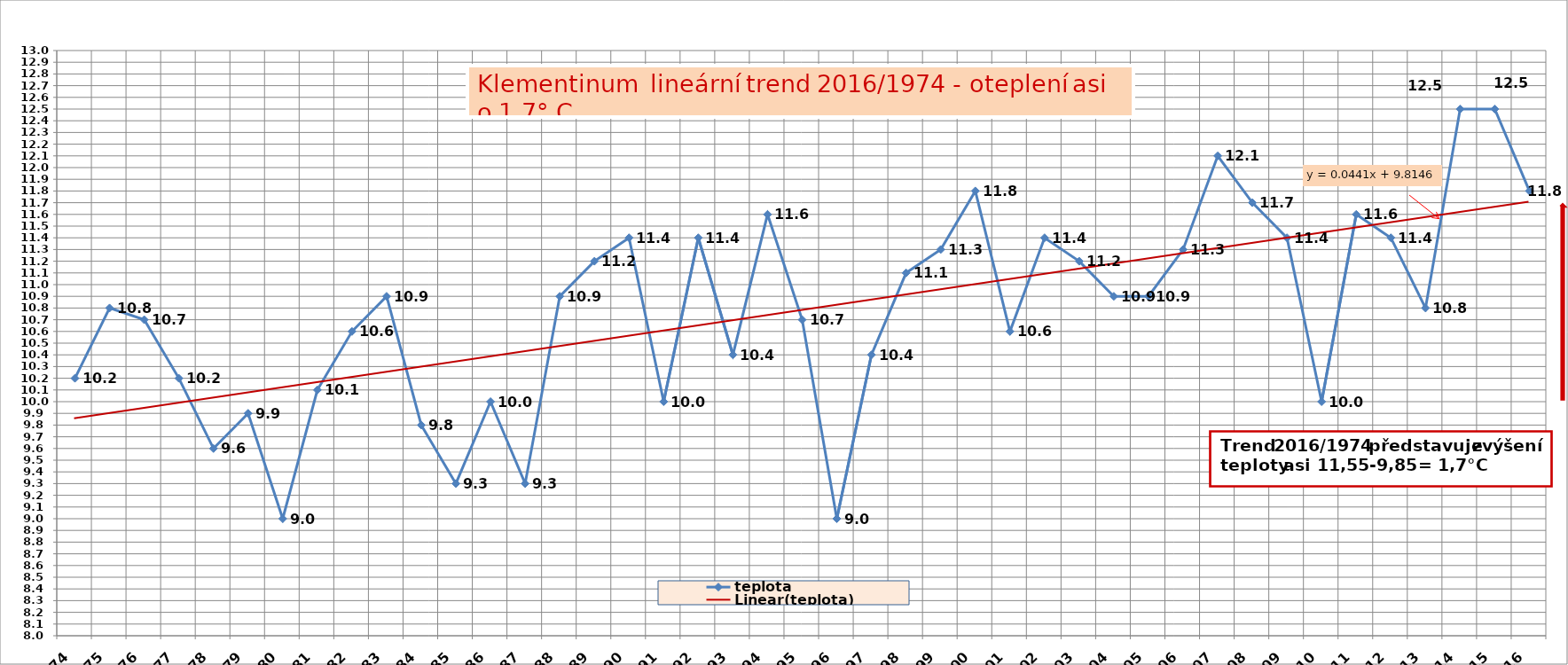
| Category | teplota |
|---|---|
| 1974 | 10.2 |
| 1975 | 10.8 |
| 1976 | 10.7 |
| 1977 | 10.2 |
| 1978 | 9.6 |
| 1979 | 9.9 |
| 1980 | 9 |
| 1981 | 10.1 |
| 1982 | 10.6 |
| 1983 | 10.9 |
| 1984 | 9.8 |
| 1985 | 9.3 |
| 1986 | 10 |
| 1987 | 9.3 |
| 1988 | 10.9 |
| 1989 | 11.2 |
| 1990 | 11.4 |
| 1991 | 10 |
| 1992 | 11.4 |
| 1993 | 10.4 |
| 1994 | 11.6 |
| 1995 | 10.7 |
| 1996 | 9 |
| 1997 | 10.4 |
| 1998 | 11.1 |
| 1999 | 11.3 |
| 2000 | 11.8 |
| 2001 | 10.6 |
| 2002 | 11.4 |
| 2003 | 11.2 |
| 2004 | 10.9 |
| 2005 | 10.9 |
| 2006 | 11.3 |
| 2007 | 12.1 |
| 2008 | 11.7 |
| 2009 | 11.4 |
| 2010 | 10 |
| 2011 | 11.6 |
| 2012 | 11.4 |
| 2013 | 10.8 |
| 2014 | 12.5 |
| 2015 | 12.5 |
| 2016 | 11.8 |